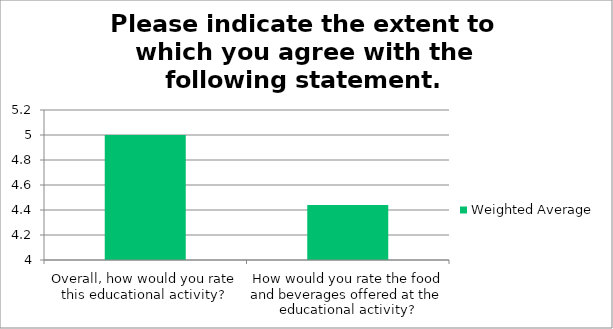
| Category | Weighted Average |
|---|---|
| Overall, how would you rate this educational activity? | 5 |
| How would you rate the food and beverages offered at the educational activity? | 4.44 |